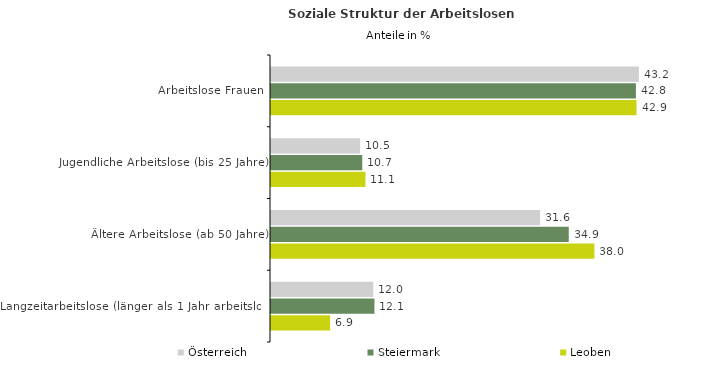
| Category | Österreich | Steiermark | Leoben |
|---|---|---|---|
| Arbeitslose Frauen | 43.18 | 42.833 | 42.903 |
| Jugendliche Arbeitslose (bis 25 Jahre) | 10.46 | 10.711 | 11.085 |
| Ältere Arbeitslose (ab 50 Jahre) | 31.584 | 34.947 | 37.959 |
| Langzeitarbeitslose (länger als 1 Jahr arbeitslos) | 11.999 | 12.142 | 6.938 |